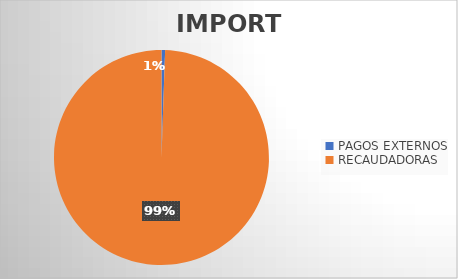
| Category | IMPORTE |
|---|---|
| PAGOS EXTERNOS | 2690027.23 |
| RECAUDADORAS | 495333544.85 |